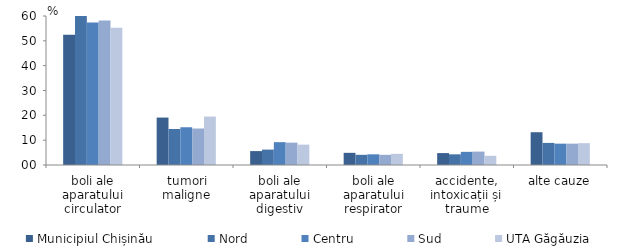
| Category | Municipiul Chișinău | Nord | Centru | Sud | UTA Găgăuzia |
|---|---|---|---|---|---|
| boli ale aparatului circulator | 52.4 | 62 | 57.4 | 58.2 | 55.3 |
| tumori maligne | 19.1 | 14.5 | 15.2 | 14.7 | 19.5 |
| boli ale aparatului digestiv | 5.6 | 6.2 | 9.2 | 9 | 8.2 |
| boli ale aparatului respirator | 4.9 | 4.1 | 4.3 | 4.1 | 4.5 |
| accidente, intoxicații și traume | 4.8 | 4.3 | 5.3 | 5.4 | 3.7 |
| alte cauze | 13.2 | 8.9 | 8.6 | 8.6 | 8.8 |